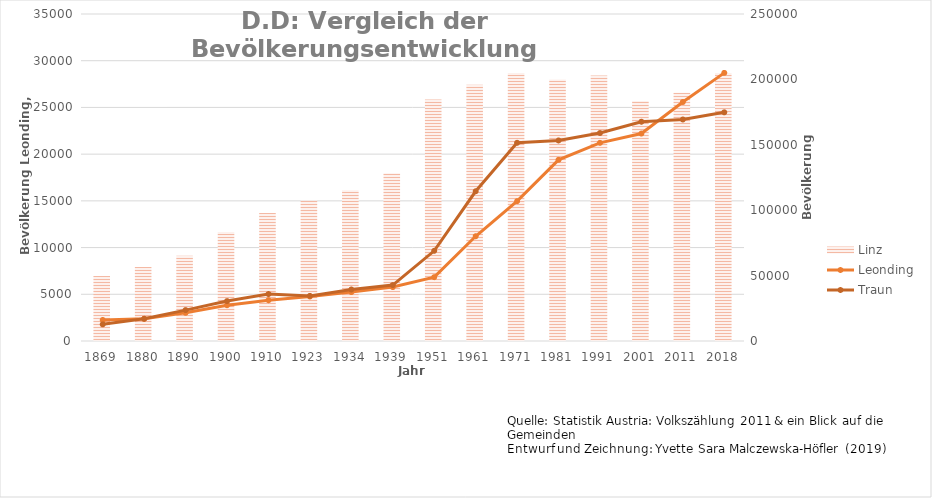
| Category | Linz |
|---|---|
| 1869.0 | 49635 |
| 1880.0 | 56569 |
| 1890.0 | 65090 |
| 1900.0 | 83356 |
| 1910.0 | 97852 |
| 1923.0 | 107463 |
| 1934.0 | 115338 |
| 1939.0 | 128177 |
| 1951.0 | 184685 |
| 1961.0 | 195978 |
| 1971.0 | 204889 |
| 1981.0 | 199910 |
| 1991.0 | 203044 |
| 2001.0 | 183504 |
| 2011.0 | 189889 |
| 2018.0 | 204846 |